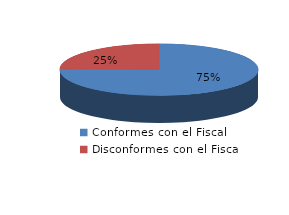
| Category | Series 0 |
|---|---|
| 0 | 1150 |
| 1 | 381 |